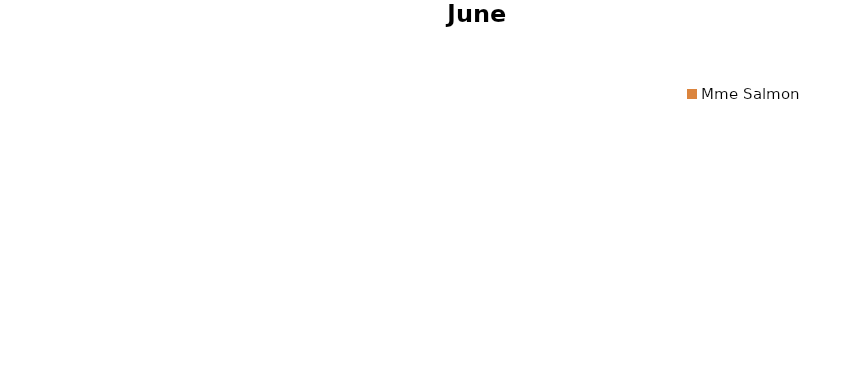
| Category | juin 2013 |
|---|---|
| Mme D'Harcourt | 0 |
| Mme Bertrand | 0 |
| Mlle Vanthomme | 0 |
| Mme Tercinier | 0 |
| Mme De Vilelle | 0 |
| Mme Salmon | 0 |